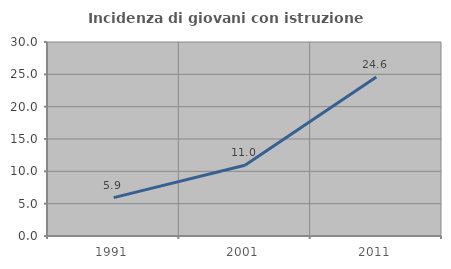
| Category | Incidenza di giovani con istruzione universitaria |
|---|---|
| 1991.0 | 5.932 |
| 2001.0 | 10.952 |
| 2011.0 | 24.599 |